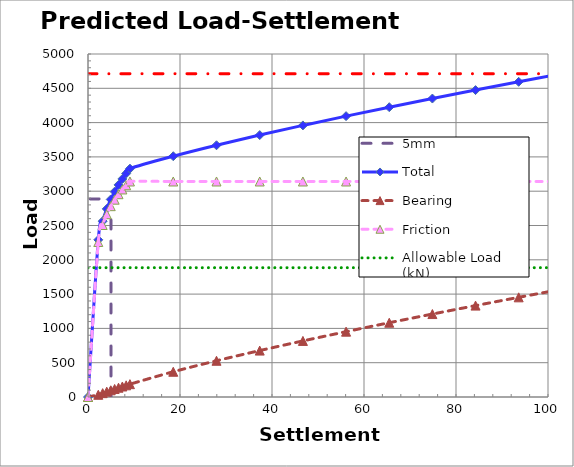
| Category | 5mm |
|---|---|
| 5.0 | 0 |
| 5.0 | 2887.569 |
| 0.0 | 2887.569 |